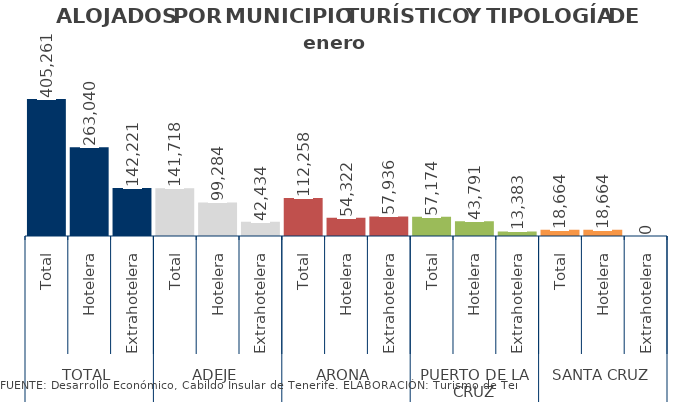
| Category | enero 2014 |
|---|---|
| 0 | 405261 |
| 1 | 263040 |
| 2 | 142221 |
| 3 | 141718 |
| 4 | 99284 |
| 5 | 42434 |
| 6 | 112258 |
| 7 | 54322 |
| 8 | 57936 |
| 9 | 57174 |
| 10 | 43791 |
| 11 | 13383 |
| 12 | 18664 |
| 13 | 18664 |
| 14 | 0 |